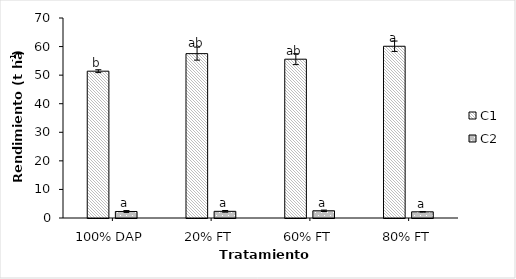
| Category | C1 | C2 |
|---|---|---|
| 100% DAP | 51.389 | 2.278 |
| 20% FT | 57.528 | 2.333 |
| 60% FT | 55.583 | 2.528 |
| 80% FT | 60.111 | 2.167 |